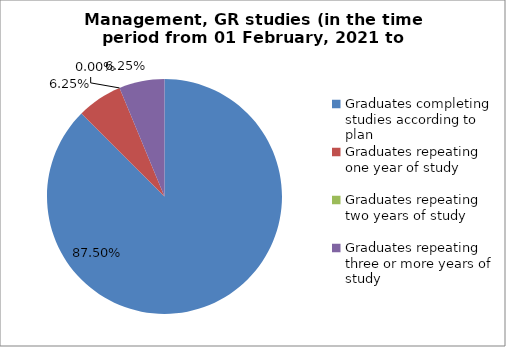
| Category | Series 0 |
|---|---|
| Graduates completing studies according to plan | 87.5 |
| Graduates repeating one year of study | 6.25 |
| Graduates repeating two years of study | 0 |
| Graduates repeating three or more years of study | 6.25 |